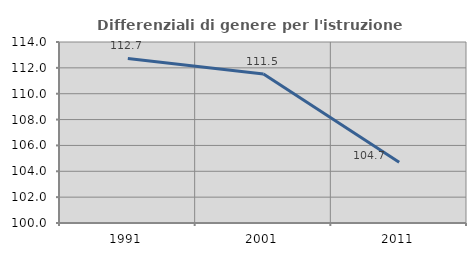
| Category | Differenziali di genere per l'istruzione superiore |
|---|---|
| 1991.0 | 112.726 |
| 2001.0 | 111.524 |
| 2011.0 | 104.708 |